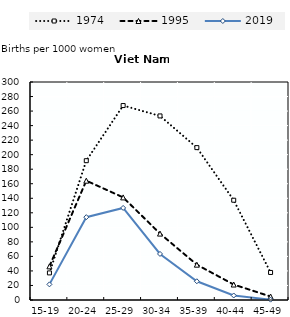
| Category | 1974 | 1995 | 2019 |
|---|---|---|---|
| 15-19 | 37.3 | 46.3 | 21.5 |
| 20-24 | 191.7 | 164.2 | 114 |
| 25-29 | 267.6 | 141.2 | 126.7 |
| 30-34 | 253.3 | 91.4 | 63.4 |
| 35-39 | 209.7 | 48.6 | 25.8 |
| 40-44 | 137.3 | 21.3 | 6.2 |
| 45-49 | 37.9 | 4.8 | 0.5 |